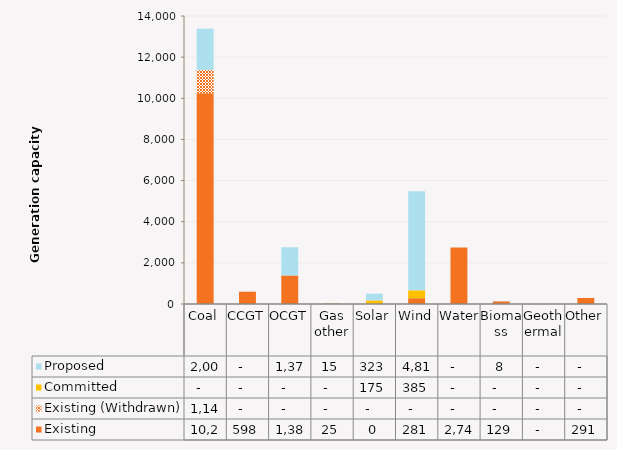
| Category | Existing | Existing (Withdrawn) | Committed | Proposed |
|---|---|---|---|---|
| Coal | 10240.2 | 1143.8 | 0 | 2000 |
| CCGT | 598.2 | 0 | 0 | 0 |
| OCGT | 1388 | 0 | 0 | 1370 |
| Gas other | 25.4 | 0 | 0 | 15 |
| Solar | 0.13 | 0 | 175 | 323 |
| Wind | 280.8 | 0 | 385.2 | 4816.9 |
| Water | 2744.7 | 0 | 0 | 0 |
| Biomass | 128.7 | 0 | 0 | 8 |
| Geothermal | 0 | 0 | 0 | 0 |
| Other | 291 | 0 | 0 | 0 |